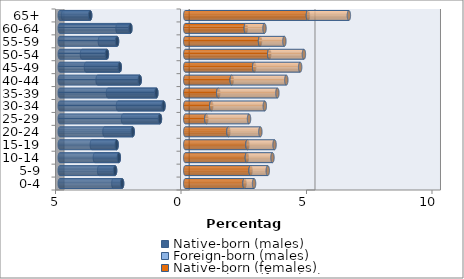
| Category | Native-born (males) | Foreign-born (males) | Native-born (females) | Foreign-born (females) |
|---|---|---|---|---|
| 0-4 | -2.516 | -0.349 | 2.36 | 0.381 |
| 5-9 | -2.796 | -0.636 | 2.602 | 0.685 |
| 10-14 | -2.646 | -0.954 | 2.455 | 1.02 |
| 15-19 | -2.733 | -0.988 | 2.477 | 1.081 |
| 20-24 | -2.092 | -1.127 | 1.718 | 1.274 |
| 25-29 | -1.009 | -1.472 | 0.839 | 1.702 |
| 30-34 | -0.867 | -1.814 | 1.036 | 2.134 |
| 35-39 | -1.151 | -1.928 | 1.314 | 2.357 |
| 40-44 | -1.814 | -1.678 | 1.852 | 2.175 |
| 45-49 | -2.609 | -1.347 | 2.746 | 1.832 |
| 50-54 | -3.121 | -0.994 | 3.345 | 1.383 |
| 55-59 | -2.718 | -0.684 | 2.979 | 0.97 |
| 60-64 | -2.185 | -0.512 | 2.413 | 0.744 |
| 65+ | -3.788 | -1.08 | 4.887 | 1.632 |